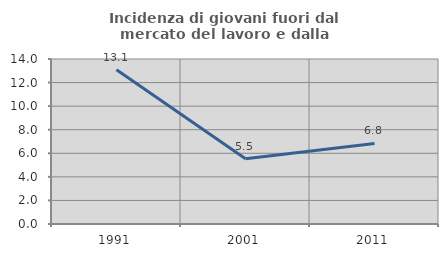
| Category | Incidenza di giovani fuori dal mercato del lavoro e dalla formazione  |
|---|---|
| 1991.0 | 13.086 |
| 2001.0 | 5.54 |
| 2011.0 | 6.835 |